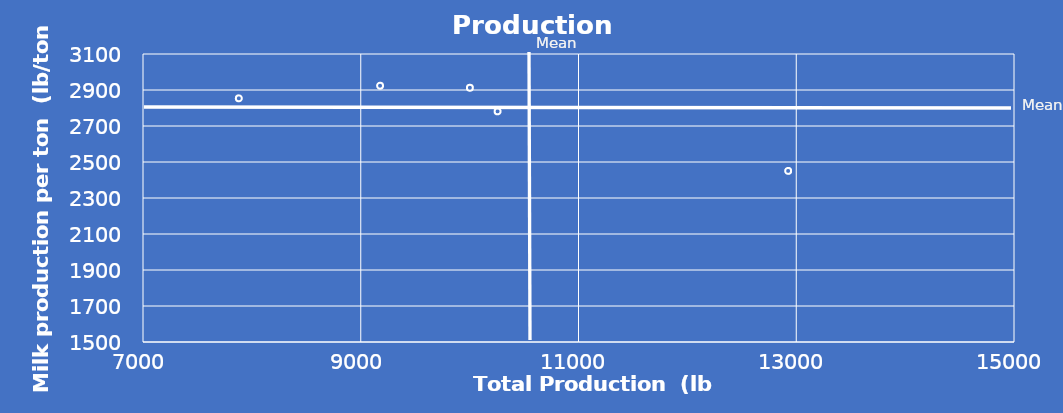
| Category | Series 0 |
|---|---|
| 7880.179725903 | 2853.75 |
| 9177.425625708 | 2923.75 |
| 10002.491198386 | 2912.5 |
| 12925.43223371 | 2450.5 |
| 10257.15061092 | 2781.25 |